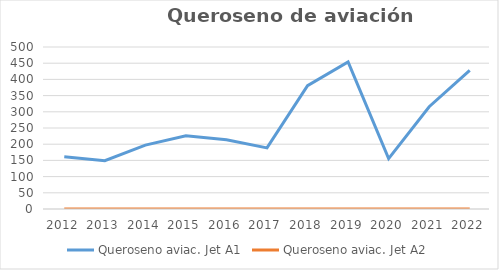
| Category | Queroseno aviac. Jet A1 | Queroseno aviac. Jet A2 |
|---|---|---|
| 2012.0 | 161.524 | 0.065 |
| 2013.0 | 148.95 | 0.022 |
| 2014.0 | 197.209 | 0.03 |
| 2015.0 | 225.935 | 0 |
| 2016.0 | 213.608 | 0 |
| 2017.0 | 188.614 | 0 |
| 2018.0 | 380.855 | 0 |
| 2019.0 | 454.21 | 0 |
| 2020.0 | 155.319 | 0 |
| 2021.0 | 315.619 | 0 |
| 2022.0 | 427.493 | 0 |